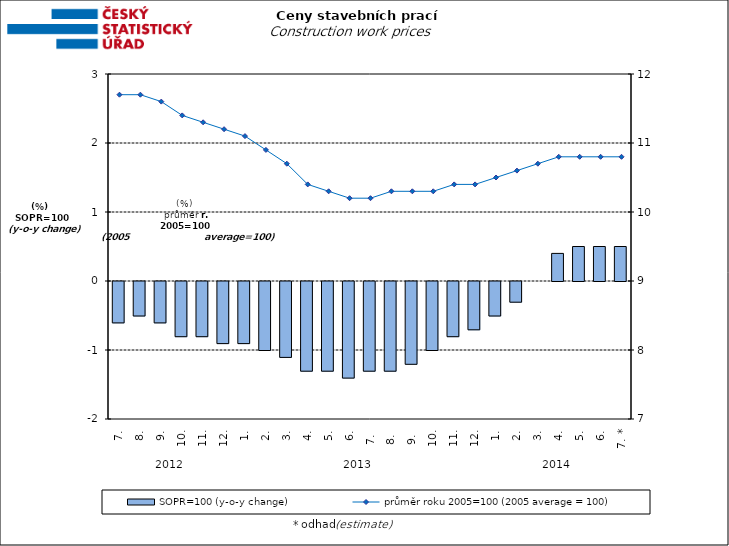
| Category | SOPR=100 (y-o-y change)   |
|---|---|
| 0 | -0.6 |
| 1 | -0.5 |
| 2 | -0.6 |
| 3 | -0.8 |
| 4 | -0.8 |
| 5 | -0.9 |
| 6 | -0.9 |
| 7 | -1 |
| 8 | -1.1 |
| 9 | -1.3 |
| 10 | -1.3 |
| 11 | -1.4 |
| 12 | -1.3 |
| 13 | -1.3 |
| 14 | -1.2 |
| 15 | -1 |
| 16 | -0.8 |
| 17 | -0.7 |
| 18 | -0.5 |
| 19 | -0.3 |
| 20 | 0 |
| 21 | 0.4 |
| 22 | 0.5 |
| 23 | 0.5 |
| 24 | 0.5 |